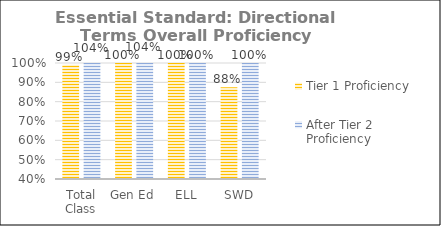
| Category | Tier 1 Proficiency | After Tier 2 Proficiency |
|---|---|---|
| Total Class | 0.991 | 1.035 |
| Gen Ed | 1 | 1.039 |
| ELL | 1 | 1 |
| SWD | 0.875 | 1 |